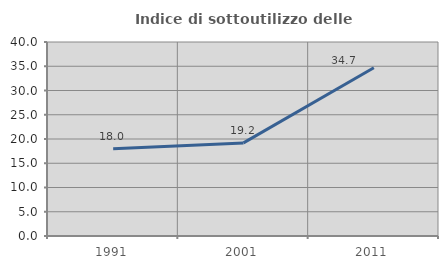
| Category | Indice di sottoutilizzo delle abitazioni  |
|---|---|
| 1991.0 | 17.972 |
| 2001.0 | 19.192 |
| 2011.0 | 34.694 |